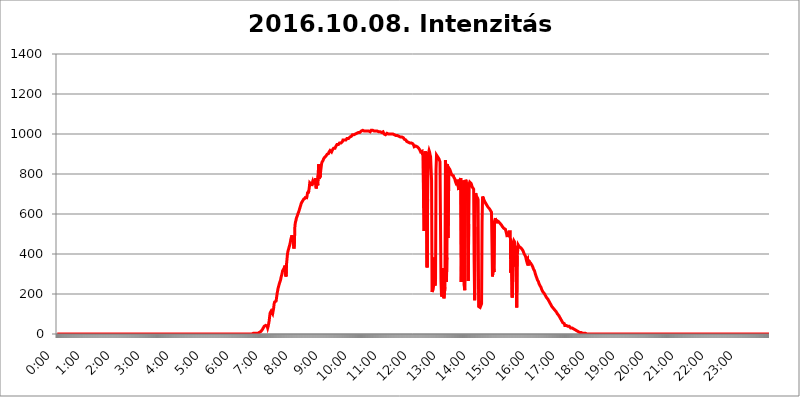
| Category | 2016.10.08. Intenzitás [W/m^2] |
|---|---|
| 0.0 | 0 |
| 0.0006944444444444445 | 0 |
| 0.001388888888888889 | 0 |
| 0.0020833333333333333 | 0 |
| 0.002777777777777778 | 0 |
| 0.003472222222222222 | 0 |
| 0.004166666666666667 | 0 |
| 0.004861111111111111 | 0 |
| 0.005555555555555556 | 0 |
| 0.0062499999999999995 | 0 |
| 0.006944444444444444 | 0 |
| 0.007638888888888889 | 0 |
| 0.008333333333333333 | 0 |
| 0.009027777777777779 | 0 |
| 0.009722222222222222 | 0 |
| 0.010416666666666666 | 0 |
| 0.011111111111111112 | 0 |
| 0.011805555555555555 | 0 |
| 0.012499999999999999 | 0 |
| 0.013194444444444444 | 0 |
| 0.013888888888888888 | 0 |
| 0.014583333333333332 | 0 |
| 0.015277777777777777 | 0 |
| 0.015972222222222224 | 0 |
| 0.016666666666666666 | 0 |
| 0.017361111111111112 | 0 |
| 0.018055555555555557 | 0 |
| 0.01875 | 0 |
| 0.019444444444444445 | 0 |
| 0.02013888888888889 | 0 |
| 0.020833333333333332 | 0 |
| 0.02152777777777778 | 0 |
| 0.022222222222222223 | 0 |
| 0.02291666666666667 | 0 |
| 0.02361111111111111 | 0 |
| 0.024305555555555556 | 0 |
| 0.024999999999999998 | 0 |
| 0.025694444444444447 | 0 |
| 0.02638888888888889 | 0 |
| 0.027083333333333334 | 0 |
| 0.027777777777777776 | 0 |
| 0.02847222222222222 | 0 |
| 0.029166666666666664 | 0 |
| 0.029861111111111113 | 0 |
| 0.030555555555555555 | 0 |
| 0.03125 | 0 |
| 0.03194444444444445 | 0 |
| 0.03263888888888889 | 0 |
| 0.03333333333333333 | 0 |
| 0.034027777777777775 | 0 |
| 0.034722222222222224 | 0 |
| 0.035416666666666666 | 0 |
| 0.036111111111111115 | 0 |
| 0.03680555555555556 | 0 |
| 0.0375 | 0 |
| 0.03819444444444444 | 0 |
| 0.03888888888888889 | 0 |
| 0.03958333333333333 | 0 |
| 0.04027777777777778 | 0 |
| 0.04097222222222222 | 0 |
| 0.041666666666666664 | 0 |
| 0.042361111111111106 | 0 |
| 0.04305555555555556 | 0 |
| 0.043750000000000004 | 0 |
| 0.044444444444444446 | 0 |
| 0.04513888888888889 | 0 |
| 0.04583333333333334 | 0 |
| 0.04652777777777778 | 0 |
| 0.04722222222222222 | 0 |
| 0.04791666666666666 | 0 |
| 0.04861111111111111 | 0 |
| 0.049305555555555554 | 0 |
| 0.049999999999999996 | 0 |
| 0.05069444444444445 | 0 |
| 0.051388888888888894 | 0 |
| 0.052083333333333336 | 0 |
| 0.05277777777777778 | 0 |
| 0.05347222222222222 | 0 |
| 0.05416666666666667 | 0 |
| 0.05486111111111111 | 0 |
| 0.05555555555555555 | 0 |
| 0.05625 | 0 |
| 0.05694444444444444 | 0 |
| 0.057638888888888885 | 0 |
| 0.05833333333333333 | 0 |
| 0.05902777777777778 | 0 |
| 0.059722222222222225 | 0 |
| 0.06041666666666667 | 0 |
| 0.061111111111111116 | 0 |
| 0.06180555555555556 | 0 |
| 0.0625 | 0 |
| 0.06319444444444444 | 0 |
| 0.06388888888888888 | 0 |
| 0.06458333333333334 | 0 |
| 0.06527777777777778 | 0 |
| 0.06597222222222222 | 0 |
| 0.06666666666666667 | 0 |
| 0.06736111111111111 | 0 |
| 0.06805555555555555 | 0 |
| 0.06874999999999999 | 0 |
| 0.06944444444444443 | 0 |
| 0.07013888888888889 | 0 |
| 0.07083333333333333 | 0 |
| 0.07152777777777779 | 0 |
| 0.07222222222222223 | 0 |
| 0.07291666666666667 | 0 |
| 0.07361111111111111 | 0 |
| 0.07430555555555556 | 0 |
| 0.075 | 0 |
| 0.07569444444444444 | 0 |
| 0.0763888888888889 | 0 |
| 0.07708333333333334 | 0 |
| 0.07777777777777778 | 0 |
| 0.07847222222222222 | 0 |
| 0.07916666666666666 | 0 |
| 0.0798611111111111 | 0 |
| 0.08055555555555556 | 0 |
| 0.08125 | 0 |
| 0.08194444444444444 | 0 |
| 0.08263888888888889 | 0 |
| 0.08333333333333333 | 0 |
| 0.08402777777777777 | 0 |
| 0.08472222222222221 | 0 |
| 0.08541666666666665 | 0 |
| 0.08611111111111112 | 0 |
| 0.08680555555555557 | 0 |
| 0.08750000000000001 | 0 |
| 0.08819444444444445 | 0 |
| 0.08888888888888889 | 0 |
| 0.08958333333333333 | 0 |
| 0.09027777777777778 | 0 |
| 0.09097222222222222 | 0 |
| 0.09166666666666667 | 0 |
| 0.09236111111111112 | 0 |
| 0.09305555555555556 | 0 |
| 0.09375 | 0 |
| 0.09444444444444444 | 0 |
| 0.09513888888888888 | 0 |
| 0.09583333333333333 | 0 |
| 0.09652777777777777 | 0 |
| 0.09722222222222222 | 0 |
| 0.09791666666666667 | 0 |
| 0.09861111111111111 | 0 |
| 0.09930555555555555 | 0 |
| 0.09999999999999999 | 0 |
| 0.10069444444444443 | 0 |
| 0.1013888888888889 | 0 |
| 0.10208333333333335 | 0 |
| 0.10277777777777779 | 0 |
| 0.10347222222222223 | 0 |
| 0.10416666666666667 | 0 |
| 0.10486111111111111 | 0 |
| 0.10555555555555556 | 0 |
| 0.10625 | 0 |
| 0.10694444444444444 | 0 |
| 0.1076388888888889 | 0 |
| 0.10833333333333334 | 0 |
| 0.10902777777777778 | 0 |
| 0.10972222222222222 | 0 |
| 0.1111111111111111 | 0 |
| 0.11180555555555556 | 0 |
| 0.11180555555555556 | 0 |
| 0.1125 | 0 |
| 0.11319444444444444 | 0 |
| 0.11388888888888889 | 0 |
| 0.11458333333333333 | 0 |
| 0.11527777777777777 | 0 |
| 0.11597222222222221 | 0 |
| 0.11666666666666665 | 0 |
| 0.1173611111111111 | 0 |
| 0.11805555555555557 | 0 |
| 0.11944444444444445 | 0 |
| 0.12013888888888889 | 0 |
| 0.12083333333333333 | 0 |
| 0.12152777777777778 | 0 |
| 0.12222222222222223 | 0 |
| 0.12291666666666667 | 0 |
| 0.12291666666666667 | 0 |
| 0.12361111111111112 | 0 |
| 0.12430555555555556 | 0 |
| 0.125 | 0 |
| 0.12569444444444444 | 0 |
| 0.12638888888888888 | 0 |
| 0.12708333333333333 | 0 |
| 0.16875 | 0 |
| 0.12847222222222224 | 0 |
| 0.12916666666666668 | 0 |
| 0.12986111111111112 | 0 |
| 0.13055555555555556 | 0 |
| 0.13125 | 0 |
| 0.13194444444444445 | 0 |
| 0.1326388888888889 | 0 |
| 0.13333333333333333 | 0 |
| 0.13402777777777777 | 0 |
| 0.13402777777777777 | 0 |
| 0.13472222222222222 | 0 |
| 0.13541666666666666 | 0 |
| 0.1361111111111111 | 0 |
| 0.13749999999999998 | 0 |
| 0.13819444444444443 | 0 |
| 0.1388888888888889 | 0 |
| 0.13958333333333334 | 0 |
| 0.14027777777777778 | 0 |
| 0.14097222222222222 | 0 |
| 0.14166666666666666 | 0 |
| 0.1423611111111111 | 0 |
| 0.14305555555555557 | 0 |
| 0.14375000000000002 | 0 |
| 0.14444444444444446 | 0 |
| 0.1451388888888889 | 0 |
| 0.1451388888888889 | 0 |
| 0.14652777777777778 | 0 |
| 0.14722222222222223 | 0 |
| 0.14791666666666667 | 0 |
| 0.1486111111111111 | 0 |
| 0.14930555555555555 | 0 |
| 0.15 | 0 |
| 0.15069444444444444 | 0 |
| 0.15138888888888888 | 0 |
| 0.15208333333333332 | 0 |
| 0.15277777777777776 | 0 |
| 0.15347222222222223 | 0 |
| 0.15416666666666667 | 0 |
| 0.15486111111111112 | 0 |
| 0.15555555555555556 | 0 |
| 0.15625 | 0 |
| 0.15694444444444444 | 0 |
| 0.15763888888888888 | 0 |
| 0.15833333333333333 | 0 |
| 0.15902777777777777 | 0 |
| 0.15972222222222224 | 0 |
| 0.16041666666666668 | 0 |
| 0.16111111111111112 | 0 |
| 0.16180555555555556 | 0 |
| 0.1625 | 0 |
| 0.16319444444444445 | 0 |
| 0.1638888888888889 | 0 |
| 0.16458333333333333 | 0 |
| 0.16527777777777777 | 0 |
| 0.16597222222222222 | 0 |
| 0.16666666666666666 | 0 |
| 0.1673611111111111 | 0 |
| 0.16805555555555554 | 0 |
| 0.16874999999999998 | 0 |
| 0.16944444444444443 | 0 |
| 0.17013888888888887 | 0 |
| 0.1708333333333333 | 0 |
| 0.17152777777777775 | 0 |
| 0.17222222222222225 | 0 |
| 0.1729166666666667 | 0 |
| 0.17361111111111113 | 0 |
| 0.17430555555555557 | 0 |
| 0.17500000000000002 | 0 |
| 0.17569444444444446 | 0 |
| 0.1763888888888889 | 0 |
| 0.17708333333333334 | 0 |
| 0.17777777777777778 | 0 |
| 0.17847222222222223 | 0 |
| 0.17916666666666667 | 0 |
| 0.1798611111111111 | 0 |
| 0.18055555555555555 | 0 |
| 0.18125 | 0 |
| 0.18194444444444444 | 0 |
| 0.1826388888888889 | 0 |
| 0.18333333333333335 | 0 |
| 0.1840277777777778 | 0 |
| 0.18472222222222223 | 0 |
| 0.18541666666666667 | 0 |
| 0.18611111111111112 | 0 |
| 0.18680555555555556 | 0 |
| 0.1875 | 0 |
| 0.18819444444444444 | 0 |
| 0.18888888888888888 | 0 |
| 0.18958333333333333 | 0 |
| 0.19027777777777777 | 0 |
| 0.1909722222222222 | 0 |
| 0.19166666666666665 | 0 |
| 0.19236111111111112 | 0 |
| 0.19305555555555554 | 0 |
| 0.19375 | 0 |
| 0.19444444444444445 | 0 |
| 0.1951388888888889 | 0 |
| 0.19583333333333333 | 0 |
| 0.19652777777777777 | 0 |
| 0.19722222222222222 | 0 |
| 0.19791666666666666 | 0 |
| 0.1986111111111111 | 0 |
| 0.19930555555555554 | 0 |
| 0.19999999999999998 | 0 |
| 0.20069444444444443 | 0 |
| 0.20138888888888887 | 0 |
| 0.2020833333333333 | 0 |
| 0.2027777777777778 | 0 |
| 0.2034722222222222 | 0 |
| 0.2041666666666667 | 0 |
| 0.20486111111111113 | 0 |
| 0.20555555555555557 | 0 |
| 0.20625000000000002 | 0 |
| 0.20694444444444446 | 0 |
| 0.2076388888888889 | 0 |
| 0.20833333333333334 | 0 |
| 0.20902777777777778 | 0 |
| 0.20972222222222223 | 0 |
| 0.21041666666666667 | 0 |
| 0.2111111111111111 | 0 |
| 0.21180555555555555 | 0 |
| 0.2125 | 0 |
| 0.21319444444444444 | 0 |
| 0.2138888888888889 | 0 |
| 0.21458333333333335 | 0 |
| 0.2152777777777778 | 0 |
| 0.21597222222222223 | 0 |
| 0.21666666666666667 | 0 |
| 0.21736111111111112 | 0 |
| 0.21805555555555556 | 0 |
| 0.21875 | 0 |
| 0.21944444444444444 | 0 |
| 0.22013888888888888 | 0 |
| 0.22083333333333333 | 0 |
| 0.22152777777777777 | 0 |
| 0.2222222222222222 | 0 |
| 0.22291666666666665 | 0 |
| 0.2236111111111111 | 0 |
| 0.22430555555555556 | 0 |
| 0.225 | 0 |
| 0.22569444444444445 | 0 |
| 0.2263888888888889 | 0 |
| 0.22708333333333333 | 0 |
| 0.22777777777777777 | 0 |
| 0.22847222222222222 | 0 |
| 0.22916666666666666 | 0 |
| 0.2298611111111111 | 0 |
| 0.23055555555555554 | 0 |
| 0.23124999999999998 | 0 |
| 0.23194444444444443 | 0 |
| 0.23263888888888887 | 0 |
| 0.2333333333333333 | 0 |
| 0.2340277777777778 | 0 |
| 0.2347222222222222 | 0 |
| 0.2354166666666667 | 0 |
| 0.23611111111111113 | 0 |
| 0.23680555555555557 | 0 |
| 0.23750000000000002 | 0 |
| 0.23819444444444446 | 0 |
| 0.2388888888888889 | 0 |
| 0.23958333333333334 | 0 |
| 0.24027777777777778 | 0 |
| 0.24097222222222223 | 0 |
| 0.24166666666666667 | 0 |
| 0.2423611111111111 | 0 |
| 0.24305555555555555 | 0 |
| 0.24375 | 0 |
| 0.24444444444444446 | 0 |
| 0.24513888888888888 | 0 |
| 0.24583333333333335 | 0 |
| 0.2465277777777778 | 0 |
| 0.24722222222222223 | 0 |
| 0.24791666666666667 | 0 |
| 0.24861111111111112 | 0 |
| 0.24930555555555556 | 0 |
| 0.25 | 0 |
| 0.25069444444444444 | 0 |
| 0.2513888888888889 | 0 |
| 0.2520833333333333 | 0 |
| 0.25277777777777777 | 0 |
| 0.2534722222222222 | 0 |
| 0.25416666666666665 | 0 |
| 0.2548611111111111 | 0 |
| 0.2555555555555556 | 0 |
| 0.25625000000000003 | 0 |
| 0.2569444444444445 | 0 |
| 0.2576388888888889 | 0 |
| 0.25833333333333336 | 0 |
| 0.2590277777777778 | 0 |
| 0.25972222222222224 | 0 |
| 0.2604166666666667 | 0 |
| 0.2611111111111111 | 0 |
| 0.26180555555555557 | 0 |
| 0.2625 | 0 |
| 0.26319444444444445 | 0 |
| 0.2638888888888889 | 0 |
| 0.26458333333333334 | 0 |
| 0.2652777777777778 | 0 |
| 0.2659722222222222 | 0 |
| 0.26666666666666666 | 0 |
| 0.2673611111111111 | 0 |
| 0.26805555555555555 | 0 |
| 0.26875 | 0 |
| 0.26944444444444443 | 0 |
| 0.2701388888888889 | 0 |
| 0.2708333333333333 | 0 |
| 0.27152777777777776 | 0 |
| 0.2722222222222222 | 0 |
| 0.27291666666666664 | 0 |
| 0.2736111111111111 | 0 |
| 0.2743055555555555 | 3.525 |
| 0.27499999999999997 | 3.525 |
| 0.27569444444444446 | 3.525 |
| 0.27638888888888885 | 3.525 |
| 0.27708333333333335 | 3.525 |
| 0.2777777777777778 | 3.525 |
| 0.27847222222222223 | 3.525 |
| 0.2791666666666667 | 3.525 |
| 0.2798611111111111 | 3.525 |
| 0.28055555555555556 | 3.525 |
| 0.28125 | 3.525 |
| 0.28194444444444444 | 7.887 |
| 0.2826388888888889 | 7.887 |
| 0.2833333333333333 | 7.887 |
| 0.28402777777777777 | 7.887 |
| 0.2847222222222222 | 12.257 |
| 0.28541666666666665 | 12.257 |
| 0.28611111111111115 | 12.257 |
| 0.28680555555555554 | 16.636 |
| 0.28750000000000003 | 21.024 |
| 0.2881944444444445 | 25.419 |
| 0.2888888888888889 | 29.823 |
| 0.28958333333333336 | 34.234 |
| 0.2902777777777778 | 38.653 |
| 0.29097222222222224 | 43.079 |
| 0.2916666666666667 | 43.079 |
| 0.2923611111111111 | 43.079 |
| 0.29305555555555557 | 47.511 |
| 0.29375 | 47.511 |
| 0.29444444444444445 | 38.653 |
| 0.2951388888888889 | 29.823 |
| 0.29583333333333334 | 38.653 |
| 0.2965277777777778 | 51.951 |
| 0.2972222222222222 | 65.31 |
| 0.29791666666666666 | 87.692 |
| 0.2986111111111111 | 105.69 |
| 0.29930555555555555 | 110.201 |
| 0.3 | 114.716 |
| 0.30069444444444443 | 119.235 |
| 0.3013888888888889 | 110.201 |
| 0.3020833333333333 | 101.184 |
| 0.30277777777777776 | 105.69 |
| 0.3034722222222222 | 128.284 |
| 0.30416666666666664 | 150.964 |
| 0.3048611111111111 | 160.056 |
| 0.3055555555555555 | 164.605 |
| 0.30624999999999997 | 155.509 |
| 0.3069444444444444 | 164.605 |
| 0.3076388888888889 | 182.82 |
| 0.30833333333333335 | 201.058 |
| 0.3090277777777778 | 214.746 |
| 0.30972222222222223 | 228.436 |
| 0.3104166666666667 | 237.564 |
| 0.3111111111111111 | 246.689 |
| 0.31180555555555556 | 255.813 |
| 0.3125 | 260.373 |
| 0.31319444444444444 | 269.49 |
| 0.3138888888888889 | 283.156 |
| 0.3145833333333333 | 292.259 |
| 0.31527777777777777 | 301.354 |
| 0.3159722222222222 | 314.98 |
| 0.31666666666666665 | 319.517 |
| 0.31736111111111115 | 324.052 |
| 0.31805555555555554 | 328.584 |
| 0.31875000000000003 | 333.113 |
| 0.3194444444444445 | 342.162 |
| 0.3201388888888889 | 342.162 |
| 0.32083333333333336 | 287.709 |
| 0.3215277777777778 | 346.682 |
| 0.32222222222222224 | 373.729 |
| 0.3229166666666667 | 400.638 |
| 0.3236111111111111 | 414.035 |
| 0.32430555555555557 | 418.492 |
| 0.325 | 431.833 |
| 0.32569444444444445 | 440.702 |
| 0.3263888888888889 | 449.551 |
| 0.32708333333333334 | 462.786 |
| 0.3277777777777778 | 475.972 |
| 0.3284722222222222 | 484.735 |
| 0.32916666666666666 | 493.475 |
| 0.3298611111111111 | 497.836 |
| 0.33055555555555555 | 471.582 |
| 0.33125 | 449.551 |
| 0.33194444444444443 | 427.39 |
| 0.3326388888888889 | 453.968 |
| 0.3333333333333333 | 541.121 |
| 0.3340277777777778 | 558.261 |
| 0.3347222222222222 | 566.793 |
| 0.3354166666666667 | 579.542 |
| 0.3361111111111111 | 575.299 |
| 0.3368055555555556 | 592.233 |
| 0.33749999999999997 | 600.661 |
| 0.33819444444444446 | 604.864 |
| 0.33888888888888885 | 613.252 |
| 0.33958333333333335 | 621.613 |
| 0.34027777777777773 | 629.948 |
| 0.34097222222222223 | 638.256 |
| 0.3416666666666666 | 642.4 |
| 0.3423611111111111 | 654.791 |
| 0.3430555555555555 | 658.909 |
| 0.34375 | 663.019 |
| 0.3444444444444445 | 658.909 |
| 0.3451388888888889 | 667.123 |
| 0.3458333333333334 | 675.311 |
| 0.34652777777777777 | 675.311 |
| 0.34722222222222227 | 675.311 |
| 0.34791666666666665 | 679.395 |
| 0.34861111111111115 | 687.544 |
| 0.34930555555555554 | 675.311 |
| 0.35000000000000003 | 683.473 |
| 0.3506944444444444 | 679.395 |
| 0.3513888888888889 | 711.832 |
| 0.3520833333333333 | 703.762 |
| 0.3527777777777778 | 715.858 |
| 0.3534722222222222 | 731.896 |
| 0.3541666666666667 | 755.766 |
| 0.3548611111111111 | 755.766 |
| 0.35555555555555557 | 759.723 |
| 0.35625 | 747.834 |
| 0.35694444444444445 | 739.877 |
| 0.3576388888888889 | 755.766 |
| 0.35833333333333334 | 763.674 |
| 0.3590277777777778 | 759.723 |
| 0.3597222222222222 | 747.834 |
| 0.36041666666666666 | 759.723 |
| 0.3611111111111111 | 771.559 |
| 0.36180555555555555 | 751.803 |
| 0.3625 | 779.42 |
| 0.36319444444444443 | 727.896 |
| 0.3638888888888889 | 743.859 |
| 0.3645833333333333 | 779.42 |
| 0.3652777777777778 | 743.859 |
| 0.3659722222222222 | 798.974 |
| 0.3666666666666667 | 849.199 |
| 0.3673611111111111 | 775.492 |
| 0.3680555555555556 | 791.169 |
| 0.36874999999999997 | 783.342 |
| 0.36944444444444446 | 814.519 |
| 0.37013888888888885 | 833.834 |
| 0.37083333333333335 | 853.029 |
| 0.37152777777777773 | 860.676 |
| 0.37222222222222223 | 860.676 |
| 0.3729166666666666 | 868.305 |
| 0.3736111111111111 | 875.918 |
| 0.3743055555555555 | 879.719 |
| 0.375 | 883.516 |
| 0.3756944444444445 | 887.309 |
| 0.3763888888888889 | 887.309 |
| 0.3770833333333334 | 891.099 |
| 0.37777777777777777 | 891.099 |
| 0.37847222222222227 | 898.668 |
| 0.37916666666666665 | 902.447 |
| 0.37986111111111115 | 902.447 |
| 0.38055555555555554 | 902.447 |
| 0.38125000000000003 | 909.996 |
| 0.3819444444444444 | 909.996 |
| 0.3826388888888889 | 917.534 |
| 0.3833333333333333 | 921.298 |
| 0.3840277777777778 | 921.298 |
| 0.3847222222222222 | 909.996 |
| 0.3854166666666667 | 913.766 |
| 0.3861111111111111 | 921.298 |
| 0.38680555555555557 | 925.06 |
| 0.3875 | 928.819 |
| 0.38819444444444445 | 925.06 |
| 0.3888888888888889 | 925.06 |
| 0.38958333333333334 | 928.819 |
| 0.3902777777777778 | 932.576 |
| 0.3909722222222222 | 940.082 |
| 0.39166666666666666 | 943.832 |
| 0.3923611111111111 | 947.58 |
| 0.39305555555555555 | 947.58 |
| 0.39375 | 947.58 |
| 0.39444444444444443 | 947.58 |
| 0.3951388888888889 | 951.327 |
| 0.3958333333333333 | 955.071 |
| 0.3965277777777778 | 955.071 |
| 0.3972222222222222 | 958.814 |
| 0.3979166666666667 | 955.071 |
| 0.3986111111111111 | 955.071 |
| 0.3993055555555556 | 955.071 |
| 0.39999999999999997 | 962.555 |
| 0.40069444444444446 | 970.034 |
| 0.40138888888888885 | 970.034 |
| 0.40208333333333335 | 966.295 |
| 0.40277777777777773 | 970.034 |
| 0.40347222222222223 | 970.034 |
| 0.4041666666666666 | 970.034 |
| 0.4048611111111111 | 970.034 |
| 0.4055555555555555 | 970.034 |
| 0.40625 | 977.508 |
| 0.4069444444444445 | 977.508 |
| 0.4076388888888889 | 977.508 |
| 0.4083333333333334 | 977.508 |
| 0.40902777777777777 | 981.244 |
| 0.40972222222222227 | 981.244 |
| 0.41041666666666665 | 984.98 |
| 0.41111111111111115 | 984.98 |
| 0.41180555555555554 | 984.98 |
| 0.41250000000000003 | 988.714 |
| 0.4131944444444444 | 992.448 |
| 0.4138888888888889 | 996.182 |
| 0.4145833333333333 | 996.182 |
| 0.4152777777777778 | 996.182 |
| 0.4159722222222222 | 996.182 |
| 0.4166666666666667 | 996.182 |
| 0.4173611111111111 | 999.916 |
| 0.41805555555555557 | 999.916 |
| 0.41875 | 999.916 |
| 0.41944444444444445 | 999.916 |
| 0.4201388888888889 | 1003.65 |
| 0.42083333333333334 | 1007.383 |
| 0.4215277777777778 | 1007.383 |
| 0.4222222222222222 | 1007.383 |
| 0.42291666666666666 | 1007.383 |
| 0.4236111111111111 | 1007.383 |
| 0.42430555555555555 | 1007.383 |
| 0.425 | 1007.383 |
| 0.42569444444444443 | 1011.118 |
| 0.4263888888888889 | 1014.852 |
| 0.4270833333333333 | 1014.852 |
| 0.4277777777777778 | 1018.587 |
| 0.4284722222222222 | 1018.587 |
| 0.4291666666666667 | 1018.587 |
| 0.4298611111111111 | 1018.587 |
| 0.4305555555555556 | 1014.852 |
| 0.43124999999999997 | 1014.852 |
| 0.43194444444444446 | 1014.852 |
| 0.43263888888888885 | 1014.852 |
| 0.43333333333333335 | 1014.852 |
| 0.43402777777777773 | 1014.852 |
| 0.43472222222222223 | 1014.852 |
| 0.4354166666666666 | 1014.852 |
| 0.4361111111111111 | 1014.852 |
| 0.4368055555555555 | 1014.852 |
| 0.4375 | 1014.852 |
| 0.4381944444444445 | 1014.852 |
| 0.4388888888888889 | 1011.118 |
| 0.4395833333333334 | 1014.852 |
| 0.44027777777777777 | 1018.587 |
| 0.44097222222222227 | 1018.587 |
| 0.44166666666666665 | 1018.587 |
| 0.44236111111111115 | 1018.587 |
| 0.44305555555555554 | 1018.587 |
| 0.44375000000000003 | 1014.852 |
| 0.4444444444444444 | 1014.852 |
| 0.4451388888888889 | 1014.852 |
| 0.4458333333333333 | 1014.852 |
| 0.4465277777777778 | 1014.852 |
| 0.4472222222222222 | 1014.852 |
| 0.4479166666666667 | 1014.852 |
| 0.4486111111111111 | 1014.852 |
| 0.44930555555555557 | 1011.118 |
| 0.45 | 1011.118 |
| 0.45069444444444445 | 1011.118 |
| 0.4513888888888889 | 1011.118 |
| 0.45208333333333334 | 1011.118 |
| 0.4527777777777778 | 1011.118 |
| 0.4534722222222222 | 1007.383 |
| 0.45416666666666666 | 1011.118 |
| 0.4548611111111111 | 1007.383 |
| 0.45555555555555555 | 1007.383 |
| 0.45625 | 1011.118 |
| 0.45694444444444443 | 1011.118 |
| 0.4576388888888889 | 1011.118 |
| 0.4583333333333333 | 999.916 |
| 0.4590277777777778 | 996.182 |
| 0.4597222222222222 | 996.182 |
| 0.4604166666666667 | 996.182 |
| 0.4611111111111111 | 996.182 |
| 0.4618055555555556 | 996.182 |
| 0.46249999999999997 | 1003.65 |
| 0.46319444444444446 | 999.916 |
| 0.46388888888888885 | 999.916 |
| 0.46458333333333335 | 999.916 |
| 0.46527777777777773 | 1003.65 |
| 0.46597222222222223 | 999.916 |
| 0.4666666666666666 | 999.916 |
| 0.4673611111111111 | 999.916 |
| 0.4680555555555555 | 996.182 |
| 0.46875 | 999.916 |
| 0.4694444444444445 | 999.916 |
| 0.4701388888888889 | 996.182 |
| 0.4708333333333334 | 999.916 |
| 0.47152777777777777 | 999.916 |
| 0.47222222222222227 | 999.916 |
| 0.47291666666666665 | 996.182 |
| 0.47361111111111115 | 996.182 |
| 0.47430555555555554 | 992.448 |
| 0.47500000000000003 | 992.448 |
| 0.4756944444444444 | 992.448 |
| 0.4763888888888889 | 992.448 |
| 0.4770833333333333 | 992.448 |
| 0.4777777777777778 | 992.448 |
| 0.4784722222222222 | 988.714 |
| 0.4791666666666667 | 988.714 |
| 0.4798611111111111 | 984.98 |
| 0.48055555555555557 | 984.98 |
| 0.48125 | 984.98 |
| 0.48194444444444445 | 984.98 |
| 0.4826388888888889 | 984.98 |
| 0.48333333333333334 | 984.98 |
| 0.4840277777777778 | 981.244 |
| 0.4847222222222222 | 981.244 |
| 0.48541666666666666 | 981.244 |
| 0.4861111111111111 | 977.508 |
| 0.48680555555555555 | 973.772 |
| 0.4875 | 973.772 |
| 0.48819444444444443 | 970.034 |
| 0.4888888888888889 | 970.034 |
| 0.4895833333333333 | 970.034 |
| 0.4902777777777778 | 962.555 |
| 0.4909722222222222 | 958.814 |
| 0.4916666666666667 | 958.814 |
| 0.4923611111111111 | 958.814 |
| 0.4930555555555556 | 962.555 |
| 0.49374999999999997 | 958.814 |
| 0.49444444444444446 | 955.071 |
| 0.49513888888888885 | 951.327 |
| 0.49583333333333335 | 955.071 |
| 0.49652777777777773 | 955.071 |
| 0.49722222222222223 | 951.327 |
| 0.4979166666666666 | 951.327 |
| 0.4986111111111111 | 951.327 |
| 0.4993055555555555 | 947.58 |
| 0.5 | 943.832 |
| 0.5006944444444444 | 936.33 |
| 0.5013888888888889 | 936.33 |
| 0.5020833333333333 | 940.082 |
| 0.5027777777777778 | 940.082 |
| 0.5034722222222222 | 940.082 |
| 0.5041666666666667 | 936.33 |
| 0.5048611111111111 | 936.33 |
| 0.5055555555555555 | 932.576 |
| 0.50625 | 932.576 |
| 0.5069444444444444 | 928.819 |
| 0.5076388888888889 | 925.06 |
| 0.5083333333333333 | 921.298 |
| 0.5090277777777777 | 917.534 |
| 0.5097222222222222 | 909.996 |
| 0.5104166666666666 | 906.223 |
| 0.5111111111111112 | 906.223 |
| 0.5118055555555555 | 913.766 |
| 0.5125000000000001 | 894.885 |
| 0.5131944444444444 | 902.447 |
| 0.513888888888889 | 629.948 |
| 0.5145833333333333 | 515.223 |
| 0.5152777777777778 | 845.365 |
| 0.5159722222222222 | 913.766 |
| 0.5166666666666667 | 894.885 |
| 0.517361111111111 | 909.996 |
| 0.5180555555555556 | 909.996 |
| 0.5187499999999999 | 333.113 |
| 0.5194444444444445 | 675.311 |
| 0.5201388888888888 | 849.199 |
| 0.5208333333333334 | 906.223 |
| 0.5215277777777778 | 917.534 |
| 0.5222222222222223 | 909.996 |
| 0.5229166666666667 | 894.885 |
| 0.5236111111111111 | 887.309 |
| 0.5243055555555556 | 883.516 |
| 0.525 | 767.62 |
| 0.5256944444444445 | 210.182 |
| 0.5263888888888889 | 214.746 |
| 0.5270833333333333 | 223.873 |
| 0.5277777777777778 | 237.564 |
| 0.5284722222222222 | 382.715 |
| 0.5291666666666667 | 274.047 |
| 0.5298611111111111 | 242.127 |
| 0.5305555555555556 | 274.047 |
| 0.53125 | 822.26 |
| 0.5319444444444444 | 894.885 |
| 0.5326388888888889 | 894.885 |
| 0.5333333333333333 | 887.309 |
| 0.5340277777777778 | 887.309 |
| 0.5347222222222222 | 887.309 |
| 0.5354166666666667 | 875.918 |
| 0.5361111111111111 | 868.305 |
| 0.5368055555555555 | 860.676 |
| 0.5375 | 856.855 |
| 0.5381944444444444 | 264.932 |
| 0.5388888888888889 | 196.497 |
| 0.5395833333333333 | 187.378 |
| 0.5402777777777777 | 182.82 |
| 0.5409722222222222 | 328.584 |
| 0.5416666666666666 | 196.497 |
| 0.5423611111111112 | 178.264 |
| 0.5430555555555555 | 182.82 |
| 0.5437500000000001 | 233 |
| 0.5444444444444444 | 868.305 |
| 0.545138888888889 | 743.859 |
| 0.5458333333333333 | 260.373 |
| 0.5465277777777778 | 382.715 |
| 0.5472222222222222 | 849.199 |
| 0.5479166666666667 | 480.356 |
| 0.548611111111111 | 621.613 |
| 0.5493055555555556 | 829.981 |
| 0.5499999999999999 | 829.981 |
| 0.5506944444444445 | 822.26 |
| 0.5513888888888888 | 814.519 |
| 0.5520833333333334 | 806.757 |
| 0.5527777777777778 | 802.868 |
| 0.5534722222222223 | 795.074 |
| 0.5541666666666667 | 795.074 |
| 0.5548611111111111 | 791.169 |
| 0.5555555555555556 | 791.169 |
| 0.55625 | 783.342 |
| 0.5569444444444445 | 779.42 |
| 0.5576388888888889 | 775.492 |
| 0.5583333333333333 | 763.674 |
| 0.5590277777777778 | 759.723 |
| 0.5597222222222222 | 767.62 |
| 0.5604166666666667 | 743.859 |
| 0.5611111111111111 | 771.559 |
| 0.5618055555555556 | 771.559 |
| 0.5625 | 767.62 |
| 0.5631944444444444 | 719.877 |
| 0.5638888888888889 | 763.674 |
| 0.5645833333333333 | 767.62 |
| 0.5652777777777778 | 763.674 |
| 0.5659722222222222 | 779.42 |
| 0.5666666666666667 | 260.373 |
| 0.5673611111111111 | 260.373 |
| 0.5680555555555555 | 650.667 |
| 0.56875 | 711.832 |
| 0.5694444444444444 | 642.4 |
| 0.5701388888888889 | 767.62 |
| 0.5708333333333333 | 242.127 |
| 0.5715277777777777 | 219.309 |
| 0.5722222222222222 | 671.22 |
| 0.5729166666666666 | 771.559 |
| 0.5736111111111112 | 759.723 |
| 0.5743055555555555 | 759.723 |
| 0.5750000000000001 | 747.834 |
| 0.5756944444444444 | 609.062 |
| 0.576388888888889 | 264.932 |
| 0.5770833333333333 | 549.704 |
| 0.5777777777777778 | 751.803 |
| 0.5784722222222222 | 759.723 |
| 0.5791666666666667 | 759.723 |
| 0.579861111111111 | 759.723 |
| 0.5805555555555556 | 751.803 |
| 0.5812499999999999 | 743.859 |
| 0.5819444444444445 | 735.89 |
| 0.5826388888888888 | 735.89 |
| 0.5833333333333334 | 731.896 |
| 0.5840277777777778 | 723.889 |
| 0.5847222222222223 | 360.221 |
| 0.5854166666666667 | 169.156 |
| 0.5861111111111111 | 536.82 |
| 0.5868055555555556 | 703.762 |
| 0.5875 | 695.666 |
| 0.5881944444444445 | 687.544 |
| 0.5888888888888889 | 683.473 |
| 0.5895833333333333 | 679.395 |
| 0.5902777777777778 | 671.22 |
| 0.5909722222222222 | 137.347 |
| 0.5916666666666667 | 132.814 |
| 0.5923611111111111 | 137.347 |
| 0.5930555555555556 | 132.814 |
| 0.59375 | 128.284 |
| 0.5944444444444444 | 128.284 |
| 0.5951388888888889 | 150.964 |
| 0.5958333333333333 | 558.261 |
| 0.5965277777777778 | 687.544 |
| 0.5972222222222222 | 683.473 |
| 0.5979166666666667 | 675.311 |
| 0.5986111111111111 | 671.22 |
| 0.5993055555555555 | 663.019 |
| 0.6 | 658.909 |
| 0.6006944444444444 | 658.909 |
| 0.6013888888888889 | 650.667 |
| 0.6020833333333333 | 646.537 |
| 0.6027777777777777 | 642.4 |
| 0.6034722222222222 | 642.4 |
| 0.6041666666666666 | 634.105 |
| 0.6048611111111112 | 634.105 |
| 0.6055555555555555 | 629.948 |
| 0.6062500000000001 | 625.784 |
| 0.6069444444444444 | 621.613 |
| 0.607638888888889 | 617.436 |
| 0.6083333333333333 | 613.252 |
| 0.6090277777777778 | 609.062 |
| 0.6097222222222222 | 604.864 |
| 0.6104166666666667 | 287.709 |
| 0.611111111111111 | 283.156 |
| 0.6118055555555556 | 333.113 |
| 0.6124999999999999 | 310.44 |
| 0.6131944444444445 | 562.53 |
| 0.6138888888888888 | 571.049 |
| 0.6145833333333334 | 579.542 |
| 0.6152777777777778 | 575.299 |
| 0.6159722222222223 | 553.986 |
| 0.6166666666666667 | 566.793 |
| 0.6173611111111111 | 566.793 |
| 0.6180555555555556 | 571.049 |
| 0.61875 | 562.53 |
| 0.6194444444444445 | 558.261 |
| 0.6201388888888889 | 558.261 |
| 0.6208333333333333 | 553.986 |
| 0.6215277777777778 | 553.986 |
| 0.6222222222222222 | 549.704 |
| 0.6229166666666667 | 545.416 |
| 0.6236111111111111 | 541.121 |
| 0.6243055555555556 | 536.82 |
| 0.625 | 536.82 |
| 0.6256944444444444 | 532.513 |
| 0.6263888888888889 | 528.2 |
| 0.6270833333333333 | 528.2 |
| 0.6277777777777778 | 528.2 |
| 0.6284722222222222 | 523.88 |
| 0.6291666666666667 | 515.223 |
| 0.6298611111111111 | 510.885 |
| 0.6305555555555555 | 515.223 |
| 0.63125 | 484.735 |
| 0.6319444444444444 | 502.192 |
| 0.6326388888888889 | 502.192 |
| 0.6333333333333333 | 510.885 |
| 0.6340277777777777 | 515.223 |
| 0.6347222222222222 | 506.542 |
| 0.6354166666666666 | 510.885 |
| 0.6361111111111112 | 305.898 |
| 0.6368055555555555 | 400.638 |
| 0.6375000000000001 | 405.108 |
| 0.6381944444444444 | 182.82 |
| 0.638888888888889 | 445.129 |
| 0.6395833333333333 | 458.38 |
| 0.6402777777777778 | 467.187 |
| 0.6409722222222222 | 467.187 |
| 0.6416666666666667 | 458.38 |
| 0.642361111111111 | 337.639 |
| 0.6430555555555556 | 440.702 |
| 0.6437499999999999 | 260.373 |
| 0.6444444444444445 | 132.814 |
| 0.6451388888888888 | 391.685 |
| 0.6458333333333334 | 418.492 |
| 0.6465277777777778 | 445.129 |
| 0.6472222222222223 | 440.702 |
| 0.6479166666666667 | 436.27 |
| 0.6486111111111111 | 436.27 |
| 0.6493055555555556 | 436.27 |
| 0.65 | 431.833 |
| 0.6506944444444445 | 427.39 |
| 0.6513888888888889 | 427.39 |
| 0.6520833333333333 | 422.943 |
| 0.6527777777777778 | 418.492 |
| 0.6534722222222222 | 414.035 |
| 0.6541666666666667 | 409.574 |
| 0.6548611111111111 | 400.638 |
| 0.6555555555555556 | 396.164 |
| 0.65625 | 396.164 |
| 0.6569444444444444 | 387.202 |
| 0.6576388888888889 | 373.729 |
| 0.6583333333333333 | 364.728 |
| 0.6590277777777778 | 369.23 |
| 0.6597222222222222 | 373.729 |
| 0.6604166666666667 | 342.162 |
| 0.6611111111111111 | 369.23 |
| 0.6618055555555555 | 351.198 |
| 0.6625 | 360.221 |
| 0.6631944444444444 | 355.712 |
| 0.6638888888888889 | 355.712 |
| 0.6645833333333333 | 351.198 |
| 0.6652777777777777 | 351.198 |
| 0.6659722222222222 | 346.682 |
| 0.6666666666666666 | 337.639 |
| 0.6673611111111111 | 333.113 |
| 0.6680555555555556 | 324.052 |
| 0.6687500000000001 | 324.052 |
| 0.6694444444444444 | 314.98 |
| 0.6701388888888888 | 305.898 |
| 0.6708333333333334 | 296.808 |
| 0.6715277777777778 | 292.259 |
| 0.6722222222222222 | 283.156 |
| 0.6729166666666666 | 278.603 |
| 0.6736111111111112 | 269.49 |
| 0.6743055555555556 | 264.932 |
| 0.6749999999999999 | 260.373 |
| 0.6756944444444444 | 251.251 |
| 0.6763888888888889 | 246.689 |
| 0.6770833333333334 | 242.127 |
| 0.6777777777777777 | 237.564 |
| 0.6784722222222223 | 233 |
| 0.6791666666666667 | 228.436 |
| 0.6798611111111111 | 219.309 |
| 0.6805555555555555 | 219.309 |
| 0.68125 | 210.182 |
| 0.6819444444444445 | 210.182 |
| 0.6826388888888889 | 205.62 |
| 0.6833333333333332 | 201.058 |
| 0.6840277777777778 | 196.497 |
| 0.6847222222222222 | 191.937 |
| 0.6854166666666667 | 187.378 |
| 0.686111111111111 | 182.82 |
| 0.6868055555555556 | 182.82 |
| 0.6875 | 178.264 |
| 0.6881944444444444 | 173.709 |
| 0.688888888888889 | 169.156 |
| 0.6895833333333333 | 164.605 |
| 0.6902777777777778 | 160.056 |
| 0.6909722222222222 | 155.509 |
| 0.6916666666666668 | 150.964 |
| 0.6923611111111111 | 146.423 |
| 0.6930555555555555 | 141.884 |
| 0.69375 | 137.347 |
| 0.6944444444444445 | 137.347 |
| 0.6951388888888889 | 132.814 |
| 0.6958333333333333 | 128.284 |
| 0.6965277777777777 | 128.284 |
| 0.6972222222222223 | 123.758 |
| 0.6979166666666666 | 119.235 |
| 0.6986111111111111 | 119.235 |
| 0.6993055555555556 | 114.716 |
| 0.7000000000000001 | 110.201 |
| 0.7006944444444444 | 105.69 |
| 0.7013888888888888 | 101.184 |
| 0.7020833333333334 | 101.184 |
| 0.7027777777777778 | 96.682 |
| 0.7034722222222222 | 92.184 |
| 0.7041666666666666 | 87.692 |
| 0.7048611111111112 | 83.205 |
| 0.7055555555555556 | 78.722 |
| 0.7062499999999999 | 74.246 |
| 0.7069444444444444 | 69.775 |
| 0.7076388888888889 | 65.31 |
| 0.7083333333333334 | 60.85 |
| 0.7090277777777777 | 56.398 |
| 0.7097222222222223 | 51.951 |
| 0.7104166666666667 | 51.951 |
| 0.7111111111111111 | 51.951 |
| 0.7118055555555555 | 43.079 |
| 0.7125 | 43.079 |
| 0.7131944444444445 | 43.079 |
| 0.7138888888888889 | 43.079 |
| 0.7145833333333332 | 38.653 |
| 0.7152777777777778 | 38.653 |
| 0.7159722222222222 | 38.653 |
| 0.7166666666666667 | 38.653 |
| 0.717361111111111 | 38.653 |
| 0.7180555555555556 | 38.653 |
| 0.71875 | 34.234 |
| 0.7194444444444444 | 34.234 |
| 0.720138888888889 | 29.823 |
| 0.7208333333333333 | 29.823 |
| 0.7215277777777778 | 29.823 |
| 0.7222222222222222 | 29.823 |
| 0.7229166666666668 | 25.419 |
| 0.7236111111111111 | 25.419 |
| 0.7243055555555555 | 25.419 |
| 0.725 | 21.024 |
| 0.7256944444444445 | 21.024 |
| 0.7263888888888889 | 21.024 |
| 0.7270833333333333 | 21.024 |
| 0.7277777777777777 | 16.636 |
| 0.7284722222222223 | 16.636 |
| 0.7291666666666666 | 12.257 |
| 0.7298611111111111 | 12.257 |
| 0.7305555555555556 | 12.257 |
| 0.7312500000000001 | 12.257 |
| 0.7319444444444444 | 12.257 |
| 0.7326388888888888 | 7.887 |
| 0.7333333333333334 | 7.887 |
| 0.7340277777777778 | 7.887 |
| 0.7347222222222222 | 7.887 |
| 0.7354166666666666 | 7.887 |
| 0.7361111111111112 | 7.887 |
| 0.7368055555555556 | 3.525 |
| 0.7374999999999999 | 3.525 |
| 0.7381944444444444 | 3.525 |
| 0.7388888888888889 | 3.525 |
| 0.7395833333333334 | 3.525 |
| 0.7402777777777777 | 3.525 |
| 0.7409722222222223 | 3.525 |
| 0.7416666666666667 | 3.525 |
| 0.7423611111111111 | 3.525 |
| 0.7430555555555555 | 0 |
| 0.74375 | 0 |
| 0.7444444444444445 | 0 |
| 0.7451388888888889 | 0 |
| 0.7458333333333332 | 0 |
| 0.7465277777777778 | 0 |
| 0.7472222222222222 | 0 |
| 0.7479166666666667 | 0 |
| 0.748611111111111 | 0 |
| 0.7493055555555556 | 0 |
| 0.75 | 0 |
| 0.7506944444444444 | 0 |
| 0.751388888888889 | 0 |
| 0.7520833333333333 | 0 |
| 0.7527777777777778 | 0 |
| 0.7534722222222222 | 0 |
| 0.7541666666666668 | 0 |
| 0.7548611111111111 | 0 |
| 0.7555555555555555 | 0 |
| 0.75625 | 0 |
| 0.7569444444444445 | 0 |
| 0.7576388888888889 | 0 |
| 0.7583333333333333 | 0 |
| 0.7590277777777777 | 0 |
| 0.7597222222222223 | 0 |
| 0.7604166666666666 | 0 |
| 0.7611111111111111 | 0 |
| 0.7618055555555556 | 0 |
| 0.7625000000000001 | 0 |
| 0.7631944444444444 | 0 |
| 0.7638888888888888 | 0 |
| 0.7645833333333334 | 0 |
| 0.7652777777777778 | 0 |
| 0.7659722222222222 | 0 |
| 0.7666666666666666 | 0 |
| 0.7673611111111112 | 0 |
| 0.7680555555555556 | 0 |
| 0.7687499999999999 | 0 |
| 0.7694444444444444 | 0 |
| 0.7701388888888889 | 0 |
| 0.7708333333333334 | 0 |
| 0.7715277777777777 | 0 |
| 0.7722222222222223 | 0 |
| 0.7729166666666667 | 0 |
| 0.7736111111111111 | 0 |
| 0.7743055555555555 | 0 |
| 0.775 | 0 |
| 0.7756944444444445 | 0 |
| 0.7763888888888889 | 0 |
| 0.7770833333333332 | 0 |
| 0.7777777777777778 | 0 |
| 0.7784722222222222 | 0 |
| 0.7791666666666667 | 0 |
| 0.779861111111111 | 0 |
| 0.7805555555555556 | 0 |
| 0.78125 | 0 |
| 0.7819444444444444 | 0 |
| 0.782638888888889 | 0 |
| 0.7833333333333333 | 0 |
| 0.7840277777777778 | 0 |
| 0.7847222222222222 | 0 |
| 0.7854166666666668 | 0 |
| 0.7861111111111111 | 0 |
| 0.7868055555555555 | 0 |
| 0.7875 | 0 |
| 0.7881944444444445 | 0 |
| 0.7888888888888889 | 0 |
| 0.7895833333333333 | 0 |
| 0.7902777777777777 | 0 |
| 0.7909722222222223 | 0 |
| 0.7916666666666666 | 0 |
| 0.7923611111111111 | 0 |
| 0.7930555555555556 | 0 |
| 0.7937500000000001 | 0 |
| 0.7944444444444444 | 0 |
| 0.7951388888888888 | 0 |
| 0.7958333333333334 | 0 |
| 0.7965277777777778 | 0 |
| 0.7972222222222222 | 0 |
| 0.7979166666666666 | 0 |
| 0.7986111111111112 | 0 |
| 0.7993055555555556 | 0 |
| 0.7999999999999999 | 0 |
| 0.8006944444444444 | 0 |
| 0.8013888888888889 | 0 |
| 0.8020833333333334 | 0 |
| 0.8027777777777777 | 0 |
| 0.8034722222222223 | 0 |
| 0.8041666666666667 | 0 |
| 0.8048611111111111 | 0 |
| 0.8055555555555555 | 0 |
| 0.80625 | 0 |
| 0.8069444444444445 | 0 |
| 0.8076388888888889 | 0 |
| 0.8083333333333332 | 0 |
| 0.8090277777777778 | 0 |
| 0.8097222222222222 | 0 |
| 0.8104166666666667 | 0 |
| 0.811111111111111 | 0 |
| 0.8118055555555556 | 0 |
| 0.8125 | 0 |
| 0.8131944444444444 | 0 |
| 0.813888888888889 | 0 |
| 0.8145833333333333 | 0 |
| 0.8152777777777778 | 0 |
| 0.8159722222222222 | 0 |
| 0.8166666666666668 | 0 |
| 0.8173611111111111 | 0 |
| 0.8180555555555555 | 0 |
| 0.81875 | 0 |
| 0.8194444444444445 | 0 |
| 0.8201388888888889 | 0 |
| 0.8208333333333333 | 0 |
| 0.8215277777777777 | 0 |
| 0.8222222222222223 | 0 |
| 0.8229166666666666 | 0 |
| 0.8236111111111111 | 0 |
| 0.8243055555555556 | 0 |
| 0.8250000000000001 | 0 |
| 0.8256944444444444 | 0 |
| 0.8263888888888888 | 0 |
| 0.8270833333333334 | 0 |
| 0.8277777777777778 | 0 |
| 0.8284722222222222 | 0 |
| 0.8291666666666666 | 0 |
| 0.8298611111111112 | 0 |
| 0.8305555555555556 | 0 |
| 0.8312499999999999 | 0 |
| 0.8319444444444444 | 0 |
| 0.8326388888888889 | 0 |
| 0.8333333333333334 | 0 |
| 0.8340277777777777 | 0 |
| 0.8347222222222223 | 0 |
| 0.8354166666666667 | 0 |
| 0.8361111111111111 | 0 |
| 0.8368055555555555 | 0 |
| 0.8375 | 0 |
| 0.8381944444444445 | 0 |
| 0.8388888888888889 | 0 |
| 0.8395833333333332 | 0 |
| 0.8402777777777778 | 0 |
| 0.8409722222222222 | 0 |
| 0.8416666666666667 | 0 |
| 0.842361111111111 | 0 |
| 0.8430555555555556 | 0 |
| 0.84375 | 0 |
| 0.8444444444444444 | 0 |
| 0.845138888888889 | 0 |
| 0.8458333333333333 | 0 |
| 0.8465277777777778 | 0 |
| 0.8472222222222222 | 0 |
| 0.8479166666666668 | 0 |
| 0.8486111111111111 | 0 |
| 0.8493055555555555 | 0 |
| 0.85 | 0 |
| 0.8506944444444445 | 0 |
| 0.8513888888888889 | 0 |
| 0.8520833333333333 | 0 |
| 0.8527777777777777 | 0 |
| 0.8534722222222223 | 0 |
| 0.8541666666666666 | 0 |
| 0.8548611111111111 | 0 |
| 0.8555555555555556 | 0 |
| 0.8562500000000001 | 0 |
| 0.8569444444444444 | 0 |
| 0.8576388888888888 | 0 |
| 0.8583333333333334 | 0 |
| 0.8590277777777778 | 0 |
| 0.8597222222222222 | 0 |
| 0.8604166666666666 | 0 |
| 0.8611111111111112 | 0 |
| 0.8618055555555556 | 0 |
| 0.8624999999999999 | 0 |
| 0.8631944444444444 | 0 |
| 0.8638888888888889 | 0 |
| 0.8645833333333334 | 0 |
| 0.8652777777777777 | 0 |
| 0.8659722222222223 | 0 |
| 0.8666666666666667 | 0 |
| 0.8673611111111111 | 0 |
| 0.8680555555555555 | 0 |
| 0.86875 | 0 |
| 0.8694444444444445 | 0 |
| 0.8701388888888889 | 0 |
| 0.8708333333333332 | 0 |
| 0.8715277777777778 | 0 |
| 0.8722222222222222 | 0 |
| 0.8729166666666667 | 0 |
| 0.873611111111111 | 0 |
| 0.8743055555555556 | 0 |
| 0.875 | 0 |
| 0.8756944444444444 | 0 |
| 0.876388888888889 | 0 |
| 0.8770833333333333 | 0 |
| 0.8777777777777778 | 0 |
| 0.8784722222222222 | 0 |
| 0.8791666666666668 | 0 |
| 0.8798611111111111 | 0 |
| 0.8805555555555555 | 0 |
| 0.88125 | 0 |
| 0.8819444444444445 | 0 |
| 0.8826388888888889 | 0 |
| 0.8833333333333333 | 0 |
| 0.8840277777777777 | 0 |
| 0.8847222222222223 | 0 |
| 0.8854166666666666 | 0 |
| 0.8861111111111111 | 0 |
| 0.8868055555555556 | 0 |
| 0.8875000000000001 | 0 |
| 0.8881944444444444 | 0 |
| 0.8888888888888888 | 0 |
| 0.8895833333333334 | 0 |
| 0.8902777777777778 | 0 |
| 0.8909722222222222 | 0 |
| 0.8916666666666666 | 0 |
| 0.8923611111111112 | 0 |
| 0.8930555555555556 | 0 |
| 0.8937499999999999 | 0 |
| 0.8944444444444444 | 0 |
| 0.8951388888888889 | 0 |
| 0.8958333333333334 | 0 |
| 0.8965277777777777 | 0 |
| 0.8972222222222223 | 0 |
| 0.8979166666666667 | 0 |
| 0.8986111111111111 | 0 |
| 0.8993055555555555 | 0 |
| 0.9 | 0 |
| 0.9006944444444445 | 0 |
| 0.9013888888888889 | 0 |
| 0.9020833333333332 | 0 |
| 0.9027777777777778 | 0 |
| 0.9034722222222222 | 0 |
| 0.9041666666666667 | 0 |
| 0.904861111111111 | 0 |
| 0.9055555555555556 | 0 |
| 0.90625 | 0 |
| 0.9069444444444444 | 0 |
| 0.907638888888889 | 0 |
| 0.9083333333333333 | 0 |
| 0.9090277777777778 | 0 |
| 0.9097222222222222 | 0 |
| 0.9104166666666668 | 0 |
| 0.9111111111111111 | 0 |
| 0.9118055555555555 | 0 |
| 0.9125 | 0 |
| 0.9131944444444445 | 0 |
| 0.9138888888888889 | 0 |
| 0.9145833333333333 | 0 |
| 0.9152777777777777 | 0 |
| 0.9159722222222223 | 0 |
| 0.9166666666666666 | 0 |
| 0.9173611111111111 | 0 |
| 0.9180555555555556 | 0 |
| 0.9187500000000001 | 0 |
| 0.9194444444444444 | 0 |
| 0.9201388888888888 | 0 |
| 0.9208333333333334 | 0 |
| 0.9215277777777778 | 0 |
| 0.9222222222222222 | 0 |
| 0.9229166666666666 | 0 |
| 0.9236111111111112 | 0 |
| 0.9243055555555556 | 0 |
| 0.9249999999999999 | 0 |
| 0.9256944444444444 | 0 |
| 0.9263888888888889 | 0 |
| 0.9270833333333334 | 0 |
| 0.9277777777777777 | 0 |
| 0.9284722222222223 | 0 |
| 0.9291666666666667 | 0 |
| 0.9298611111111111 | 0 |
| 0.9305555555555555 | 0 |
| 0.93125 | 0 |
| 0.9319444444444445 | 0 |
| 0.9326388888888889 | 0 |
| 0.9333333333333332 | 0 |
| 0.9340277777777778 | 0 |
| 0.9347222222222222 | 0 |
| 0.9354166666666667 | 0 |
| 0.936111111111111 | 0 |
| 0.9368055555555556 | 0 |
| 0.9375 | 0 |
| 0.9381944444444444 | 0 |
| 0.938888888888889 | 0 |
| 0.9395833333333333 | 0 |
| 0.9402777777777778 | 0 |
| 0.9409722222222222 | 0 |
| 0.9416666666666668 | 0 |
| 0.9423611111111111 | 0 |
| 0.9430555555555555 | 0 |
| 0.94375 | 0 |
| 0.9444444444444445 | 0 |
| 0.9451388888888889 | 0 |
| 0.9458333333333333 | 0 |
| 0.9465277777777777 | 0 |
| 0.9472222222222223 | 0 |
| 0.9479166666666666 | 0 |
| 0.9486111111111111 | 0 |
| 0.9493055555555556 | 0 |
| 0.9500000000000001 | 0 |
| 0.9506944444444444 | 0 |
| 0.9513888888888888 | 0 |
| 0.9520833333333334 | 0 |
| 0.9527777777777778 | 0 |
| 0.9534722222222222 | 0 |
| 0.9541666666666666 | 0 |
| 0.9548611111111112 | 0 |
| 0.9555555555555556 | 0 |
| 0.9562499999999999 | 0 |
| 0.9569444444444444 | 0 |
| 0.9576388888888889 | 0 |
| 0.9583333333333334 | 0 |
| 0.9590277777777777 | 0 |
| 0.9597222222222223 | 0 |
| 0.9604166666666667 | 0 |
| 0.9611111111111111 | 0 |
| 0.9618055555555555 | 0 |
| 0.9625 | 0 |
| 0.9631944444444445 | 0 |
| 0.9638888888888889 | 0 |
| 0.9645833333333332 | 0 |
| 0.9652777777777778 | 0 |
| 0.9659722222222222 | 0 |
| 0.9666666666666667 | 0 |
| 0.967361111111111 | 0 |
| 0.9680555555555556 | 0 |
| 0.96875 | 0 |
| 0.9694444444444444 | 0 |
| 0.970138888888889 | 0 |
| 0.9708333333333333 | 0 |
| 0.9715277777777778 | 0 |
| 0.9722222222222222 | 0 |
| 0.9729166666666668 | 0 |
| 0.9736111111111111 | 0 |
| 0.9743055555555555 | 0 |
| 0.975 | 0 |
| 0.9756944444444445 | 0 |
| 0.9763888888888889 | 0 |
| 0.9770833333333333 | 0 |
| 0.9777777777777777 | 0 |
| 0.9784722222222223 | 0 |
| 0.9791666666666666 | 0 |
| 0.9798611111111111 | 0 |
| 0.9805555555555556 | 0 |
| 0.9812500000000001 | 0 |
| 0.9819444444444444 | 0 |
| 0.9826388888888888 | 0 |
| 0.9833333333333334 | 0 |
| 0.9840277777777778 | 0 |
| 0.9847222222222222 | 0 |
| 0.9854166666666666 | 0 |
| 0.9861111111111112 | 0 |
| 0.9868055555555556 | 0 |
| 0.9874999999999999 | 0 |
| 0.9881944444444444 | 0 |
| 0.9888888888888889 | 0 |
| 0.9895833333333334 | 0 |
| 0.9902777777777777 | 0 |
| 0.9909722222222223 | 0 |
| 0.9916666666666667 | 0 |
| 0.9923611111111111 | 0 |
| 0.9930555555555555 | 0 |
| 0.99375 | 0 |
| 0.9944444444444445 | 0 |
| 0.9951388888888889 | 0 |
| 0.9958333333333332 | 0 |
| 0.9965277777777778 | 0 |
| 0.9972222222222222 | 0 |
| 0.9979166666666667 | 0 |
| 0.998611111111111 | 0 |
| 0.9993055555555556 | 0 |